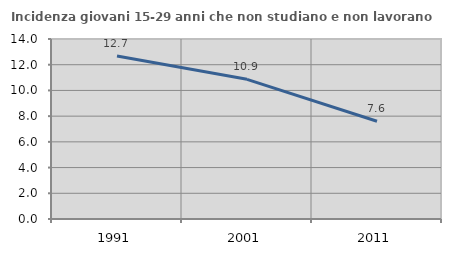
| Category | Incidenza giovani 15-29 anni che non studiano e non lavorano  |
|---|---|
| 1991.0 | 12.679 |
| 2001.0 | 10.865 |
| 2011.0 | 7.606 |